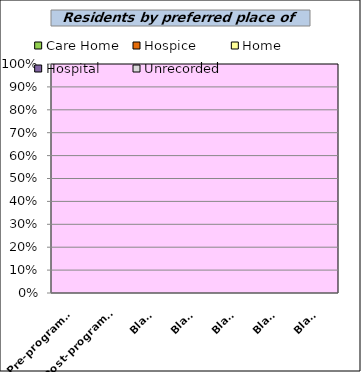
| Category | Care Home | Hospice | Home | Hospital | Unrecorded |
|---|---|---|---|---|---|
| Pre-programme | 0 | 0 | 0 | 0 | 0 |
| Post-programme | 0 | 0 | 0 | 0 | 0 |
| Blank | 0 | 0 | 0 | 0 | 0 |
| Blank | 0 | 0 | 0 | 0 | 0 |
| Blank | 0 | 0 | 0 | 0 | 0 |
| Blank | 0 | 0 | 0 | 0 | 0 |
| Blank | 0 | 0 | 0 | 0 | 0 |